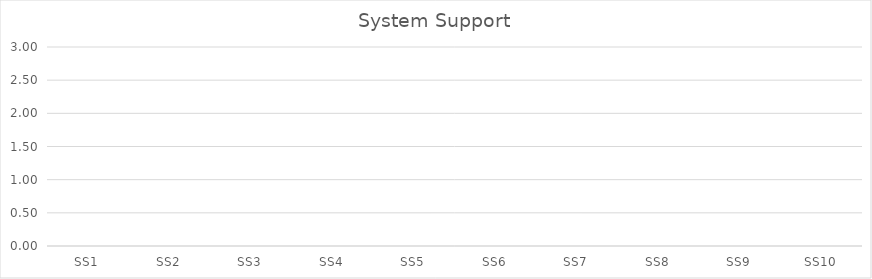
| Category | Series 0 |
|---|---|
| SS1 | 0 |
| SS2 | 0 |
| SS3 | 0 |
| SS4 | 0 |
| SS5 | 0 |
| SS6 | 0 |
| SS7 | 0 |
| SS8 | 0 |
| SS9 | 0 |
| SS10 | 0 |